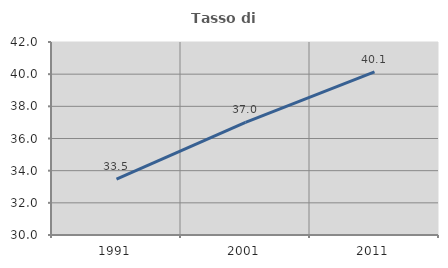
| Category | Tasso di occupazione   |
|---|---|
| 1991.0 | 33.475 |
| 2001.0 | 37.007 |
| 2011.0 | 40.141 |